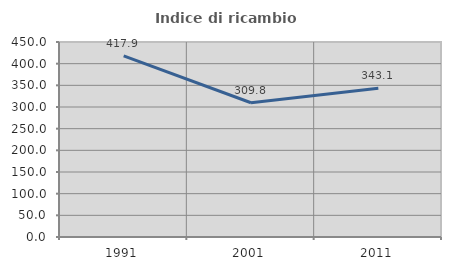
| Category | Indice di ricambio occupazionale  |
|---|---|
| 1991.0 | 417.857 |
| 2001.0 | 309.756 |
| 2011.0 | 343.137 |